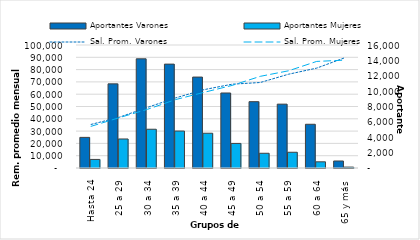
| Category | Aportantes Varones | Aportantes Mujeres |
|---|---|---|
| Hasta 24 | 3982 | 1114 |
| 25 a 29 | 10944 | 3775 |
| 30 a 34 | 14202 | 5041 |
| 35 a 39 | 13513 | 4808 |
| 40 a 44 | 11828 | 4524 |
| 45 a 49 | 9758 | 3196 |
| 50 a 54 | 8627 | 1916 |
| 55 a 59 | 8306 | 2047 |
| 60 a 64 | 5688 | 804 |
| 65 y más | 912 | 117 |